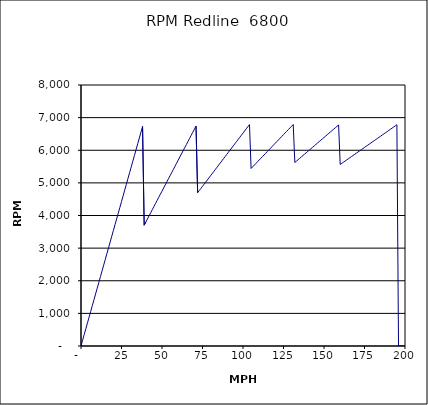
| Category | RPM Redline  6800 |
|---|---|
| 0.0 | 0 |
| 1.0 | 177.051 |
| 2.0 | 354.101 |
| 3.0 | 531.152 |
| 4.0 | 708.202 |
| 5.0 | 885.253 |
| 6.0 | 1062.303 |
| 7.0 | 1239.354 |
| 8.0 | 1416.405 |
| 9.0 | 1593.455 |
| 10.0 | 1770.506 |
| 11.0 | 1947.556 |
| 12.0 | 2124.607 |
| 13.0 | 2301.657 |
| 14.0 | 2478.708 |
| 15.0 | 2655.758 |
| 16.0 | 2832.809 |
| 17.0 | 3009.86 |
| 18.0 | 3186.91 |
| 19.0 | 3363.961 |
| 20.0 | 3541.011 |
| 21.0 | 3718.062 |
| 22.0 | 3895.112 |
| 23.0 | 4072.163 |
| 24.0 | 4249.214 |
| 25.0 | 4426.264 |
| 26.0 | 4603.315 |
| 27.0 | 4780.365 |
| 28.0 | 4957.416 |
| 29.0 | 5134.466 |
| 30.0 | 5311.517 |
| 31.0 | 5488.567 |
| 32.0 | 5665.618 |
| 33.0 | 5842.669 |
| 34.0 | 6019.719 |
| 35.0 | 6196.77 |
| 36.0 | 6373.82 |
| 37.0 | 6550.871 |
| 38.0 | 6727.921 |
| 39.0 | 3703.007 |
| 40.0 | 3797.955 |
| 41.0 | 3892.904 |
| 42.0 | 3987.853 |
| 43.0 | 4082.802 |
| 44.0 | 4177.751 |
| 45.0 | 4272.7 |
| 46.0 | 4367.649 |
| 47.0 | 4462.598 |
| 48.0 | 4557.546 |
| 49.0 | 4652.495 |
| 50.0 | 4747.444 |
| 51.0 | 4842.393 |
| 52.0 | 4937.342 |
| 53.0 | 5032.291 |
| 54.0 | 5127.24 |
| 55.0 | 5222.189 |
| 56.0 | 5317.138 |
| 57.0 | 5412.086 |
| 58.0 | 5507.035 |
| 59.0 | 5601.984 |
| 60.0 | 5696.933 |
| 61.0 | 5791.882 |
| 62.0 | 5886.831 |
| 63.0 | 5981.78 |
| 64.0 | 6076.729 |
| 65.0 | 6171.678 |
| 66.0 | 6266.626 |
| 67.0 | 6361.575 |
| 68.0 | 6456.524 |
| 69.0 | 6551.473 |
| 70.0 | 6646.422 |
| 71.0 | 6741.371 |
| 72.0 | 4698.866 |
| 73.0 | 4764.128 |
| 74.0 | 4829.39 |
| 75.0 | 4894.652 |
| 76.0 | 4959.914 |
| 77.0 | 5025.176 |
| 78.0 | 5090.438 |
| 79.0 | 5155.7 |
| 80.0 | 5220.962 |
| 81.0 | 5286.224 |
| 82.0 | 5351.486 |
| 83.0 | 5416.748 |
| 84.0 | 5482.01 |
| 85.0 | 5547.272 |
| 86.0 | 5612.534 |
| 87.0 | 5677.796 |
| 88.0 | 5743.058 |
| 89.0 | 5808.32 |
| 90.0 | 5873.582 |
| 91.0 | 5938.844 |
| 92.0 | 6004.106 |
| 93.0 | 6069.368 |
| 94.0 | 6134.63 |
| 95.0 | 6199.892 |
| 96.0 | 6265.154 |
| 97.0 | 6330.416 |
| 98.0 | 6395.678 |
| 99.0 | 6460.94 |
| 100.0 | 6526.202 |
| 101.0 | 6591.464 |
| 102.0 | 6656.726 |
| 103.0 | 6721.989 |
| 104.0 | 6787.251 |
| 105.0 | 5441.701 |
| 106.0 | 5493.527 |
| 107.0 | 5545.353 |
| 108.0 | 5597.178 |
| 109.0 | 5649.004 |
| 110.0 | 5700.83 |
| 111.0 | 5752.656 |
| 112.0 | 5804.481 |
| 113.0 | 5856.307 |
| 114.0 | 5908.133 |
| 115.0 | 5959.958 |
| 116.0 | 6011.784 |
| 117.0 | 6063.61 |
| 118.0 | 6115.436 |
| 119.0 | 6167.261 |
| 120.0 | 6219.087 |
| 121.0 | 6270.913 |
| 122.0 | 6322.738 |
| 123.0 | 6374.564 |
| 124.0 | 6426.39 |
| 125.0 | 6478.216 |
| 126.0 | 6530.041 |
| 127.0 | 6581.867 |
| 128.0 | 6633.693 |
| 129.0 | 6685.519 |
| 130.0 | 6737.344 |
| 131.0 | 6789.17 |
| 132.0 | 5624.602 |
| 133.0 | 5667.213 |
| 134.0 | 5709.824 |
| 135.0 | 5752.434 |
| 136.0 | 5795.045 |
| 137.0 | 5837.656 |
| 138.0 | 5880.266 |
| 139.0 | 5922.877 |
| 140.0 | 5965.487 |
| 141.0 | 6008.098 |
| 142.0 | 6050.709 |
| 143.0 | 6093.319 |
| 144.0 | 6135.93 |
| 145.0 | 6178.541 |
| 146.0 | 6221.151 |
| 147.0 | 6263.762 |
| 148.0 | 6306.372 |
| 149.0 | 6348.983 |
| 150.0 | 6391.594 |
| 151.0 | 6434.204 |
| 152.0 | 6476.815 |
| 153.0 | 6519.426 |
| 154.0 | 6562.036 |
| 155.0 | 6604.647 |
| 156.0 | 6647.257 |
| 157.0 | 6689.868 |
| 158.0 | 6732.479 |
| 159.0 | 6775.089 |
| 160.0 | 5564.446 |
| 161.0 | 5599.224 |
| 162.0 | 5634.002 |
| 163.0 | 5668.78 |
| 164.0 | 5703.557 |
| 165.0 | 5738.335 |
| 166.0 | 5773.113 |
| 167.0 | 5807.891 |
| 168.0 | 5842.669 |
| 169.0 | 5877.446 |
| 170.0 | 5912.224 |
| 171.0 | 5947.002 |
| 172.0 | 5981.78 |
| 173.0 | 6016.558 |
| 174.0 | 6051.335 |
| 175.0 | 6086.113 |
| 176.0 | 6120.891 |
| 177.0 | 6155.669 |
| 178.0 | 6190.446 |
| 179.0 | 6225.224 |
| 180.0 | 6260.002 |
| 181.0 | 6294.78 |
| 182.0 | 6329.558 |
| 183.0 | 6364.335 |
| 184.0 | 6399.113 |
| 185.0 | 6433.891 |
| 186.0 | 6468.669 |
| 187.0 | 6503.447 |
| 188.0 | 6538.224 |
| 189.0 | 6573.002 |
| 190.0 | 6607.78 |
| 191.0 | 6642.558 |
| 192.0 | 6677.336 |
| 193.0 | 6712.113 |
| 194.0 | 6746.891 |
| 195.0 | 6781.669 |
| 196.0 | 0 |
| 197.0 | 0 |
| 198.0 | 0 |
| 199.0 | 0 |
| 200.0 | 0 |